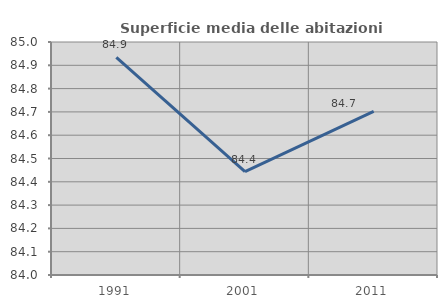
| Category | Superficie media delle abitazioni occupate |
|---|---|
| 1991.0 | 84.934 |
| 2001.0 | 84.444 |
| 2011.0 | 84.702 |